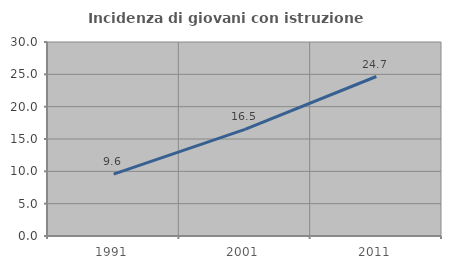
| Category | Incidenza di giovani con istruzione universitaria |
|---|---|
| 1991.0 | 9.557 |
| 2001.0 | 16.489 |
| 2011.0 | 24.665 |